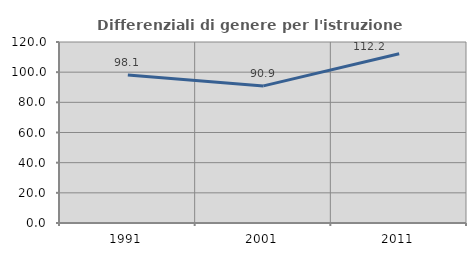
| Category | Differenziali di genere per l'istruzione superiore |
|---|---|
| 1991.0 | 98.089 |
| 2001.0 | 90.89 |
| 2011.0 | 112.185 |